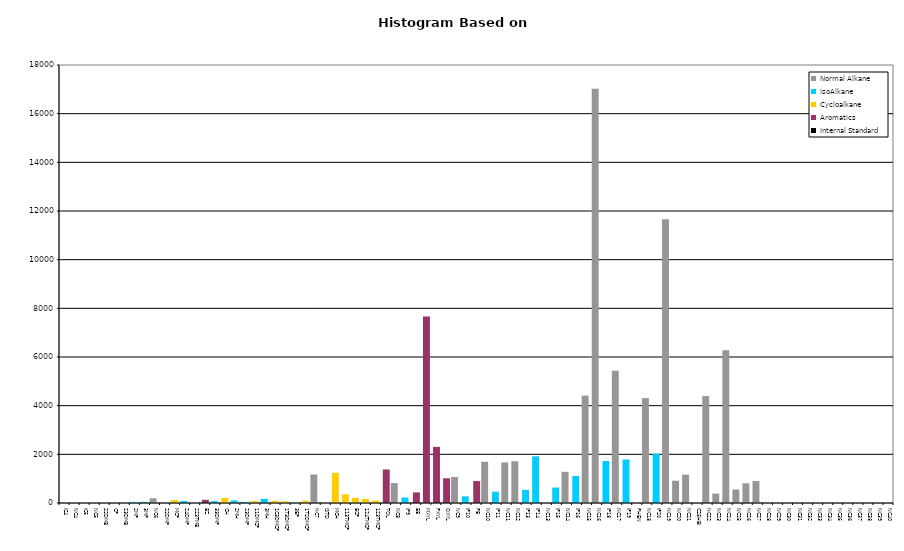
| Category | Normal Alkane | IsoAlkane | Cycloalkane | Aromatics | Internal Standard |
|---|---|---|---|---|---|
| IC4 | 0 | 0 | 0 | 0 | 0 |
| NC4 | 0 | 0 | 0 | 0 | 0 |
| IC5 | 0 | 0 | 0 | 0 | 0 |
| NC5 | 0 | 0 | 0 | 0 | 0 |
| 22DMB | 0 | 0 | 0 | 0 | 0 |
| CP | 0 | 0 | 0 | 0 | 0 |
| 23DMB | 0 | 0 | 0 | 0 | 0 |
| 2MP | 0 | 32 | 0 | 0 | 0 |
| 3MP | 0 | 47 | 0 | 0 | 0 |
| NC6 | 197 | 0 | 0 | 0 | 0 |
| 22DMP | 0 | 0 | 0 | 0 | 0 |
| MCP | 0 | 0 | 121 | 0 | 0 |
| 24DMP | 0 | 81 | 0 | 0 | 0 |
| 223TMB | 0 | 0 | 0 | 0 | 0 |
| BZ | 0 | 0 | 0 | 130 | 0 |
| 33DMP | 0 | 77 | 0 | 0 | 0 |
| CH | 0 | 0 | 205 | 0 | 0 |
| 2MH | 0 | 105 | 0 | 0 | 0 |
| 23DMP | 0 | 40 | 0 | 0 | 0 |
| 11DMCP | 0 | 0 | 76 | 0 | 0 |
| 3MH | 0 | 172 | 0 | 0 | 0 |
| 1C3DMCP | 0 | 0 | 89 | 0 | 0 |
| 1T3DMCP | 0 | 0 | 68 | 0 | 0 |
| 3EP | 0 | 12 | 0 | 0 | 0 |
| 1T2DMCP | 0 | 0 | 94 | 0 | 0 |
| NC7 | 1172 | 0 | 0 | 0 | 0 |
| ISTD | 0 | 0 | 0 | 0 | 0 |
| MCH | 0 | 0 | 1240 | 0 | 0 |
| 113TMCP | 0 | 0 | 352 | 0 | 0 |
| ECP | 0 | 0 | 212 | 0 | 0 |
| 124TMCP | 0 | 0 | 164 | 0 | 0 |
| 123TMCP | 0 | 0 | 100 | 0 | 0 |
| TOL | 0 | 0 | 0 | 1377 | 0 |
| NC8 | 818 | 0 | 0 | 0 | 0 |
| IP9 | 0 | 226 | 0 | 0 | 0 |
| EB | 0 | 0 | 0 | 435 | 0 |
| MXYL | 0 | 0 | 0 | 7665 | 0 |
| PXYL | 0 | 0 | 0 | 2306 | 0 |
| OXYL | 0 | 0 | 0 | 1016 | 0 |
| NC9 | 1069 | 0 | 0 | 0 | 0 |
| IP10 | 0 | 273 | 0 | 0 | 0 |
| PB | 0 | 0 | 0 | 901 | 0 |
| NC10 | 1694 | 0 | 0 | 0 | 0 |
| IP11 | 0 | 466 | 0 | 0 | 0 |
| NC11 | 1668 | 0 | 0 | 0 | 0 |
| NC12 | 1715 | 0 | 0 | 0 | 0 |
| IP13 | 0 | 540 | 0 | 0 | 0 |
| IP14 | 0 | 1918 | 0 | 0 | 0 |
| NC13 | 0 | 0 | 0 | 0 | 0 |
| IP15 | 0 | 635 | 0 | 0 | 0 |
| NC14 | 1282 | 0 | 0 | 0 | 0 |
| IP16 | 0 | 1110 | 0 | 0 | 0 |
| NC15 | 4413 | 0 | 0 | 0 | 0 |
| NC16 | 17019 | 0 | 0 | 0 | 0 |
| IP18 | 0 | 1725 | 0 | 0 | 0 |
| NC17 | 5432 | 0 | 0 | 0 | 0 |
| IP19 | 0 | 1786 | 0 | 0 | 0 |
| PHEN | 0 | 0 | 0 | 0 | 0 |
| NC18 | 4310 | 0 | 0 | 0 | 0 |
| IP20 | 0 | 2031 | 0 | 0 | 0 |
| NC19 | 11665 | 0 | 0 | 0 | 0 |
| NC20 | 916 | 0 | 0 | 0 | 0 |
| NC21 | 1164 | 0 | 0 | 0 | 0 |
| C25HBI | 0 | 0 | 0 | 0 | 0 |
| NC22 | 4394 | 0 | 0 | 0 | 0 |
| NC23 | 387 | 0 | 0 | 0 | 0 |
| NC24 | 6282 | 0 | 0 | 0 | 0 |
| NC25 | 554 | 0 | 0 | 0 | 0 |
| NC26 | 809 | 0 | 0 | 0 | 0 |
| NC27 | 903 | 0 | 0 | 0 | 0 |
| NC28 | 0 | 0 | 0 | 0 | 0 |
| NC29 | 0 | 0 | 0 | 0 | 0 |
| NC30 | 0 | 0 | 0 | 0 | 0 |
| NC31 | 0 | 0 | 0 | 0 | 0 |
| NC32 | 0 | 0 | 0 | 0 | 0 |
| NC33 | 0 | 0 | 0 | 0 | 0 |
| NC34 | 0 | 0 | 0 | 0 | 0 |
| NC35 | 0 | 0 | 0 | 0 | 0 |
| NC36 | 0 | 0 | 0 | 0 | 0 |
| NC37 | 0 | 0 | 0 | 0 | 0 |
| NC38 | 0 | 0 | 0 | 0 | 0 |
| NC39 | 0 | 0 | 0 | 0 | 0 |
| NC40 | 0 | 0 | 0 | 0 | 0 |